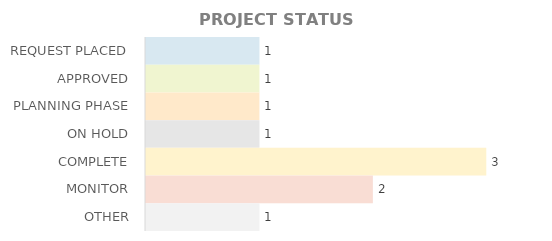
| Category | QTY |
|---|---|
| REQUEST PLACED | 1 |
| APPROVED | 1 |
| PLANNING PHASE | 1 |
| ON HOLD | 1 |
| COMPLETE | 3 |
| MONITOR | 2 |
| OTHER | 1 |